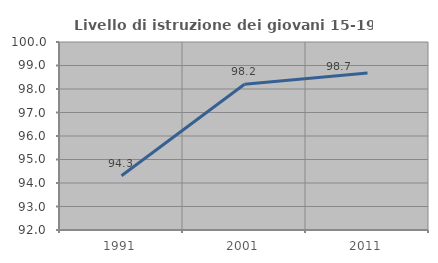
| Category | Livello di istruzione dei giovani 15-19 anni |
|---|---|
| 1991.0 | 94.307 |
| 2001.0 | 98.204 |
| 2011.0 | 98.679 |